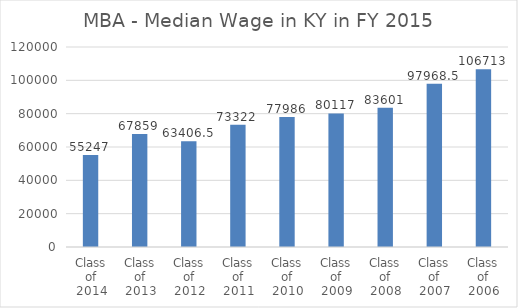
| Category | Median Wage in KY in FY 2015 |
|---|---|
| Class of 2014 | 55247 |
| Class of 2013 | 67859 |
| Class of 2012 | 63406.5 |
| Class of 2011 | 73322 |
| Class of 2010 | 77986 |
| Class of 2009 | 80117 |
| Class of 2008 | 83601 |
| Class of 2007 | 97968.5 |
| Class of 2006 | 106713 |